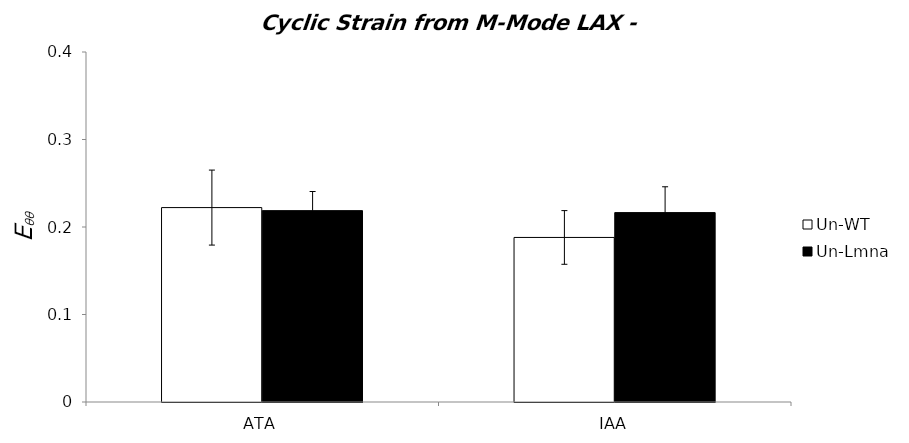
| Category | Un-WT | Un-Lmna |
|---|---|---|
| 0 | 0.222 | 0.219 |
| 1 | 0.188 | 0.216 |